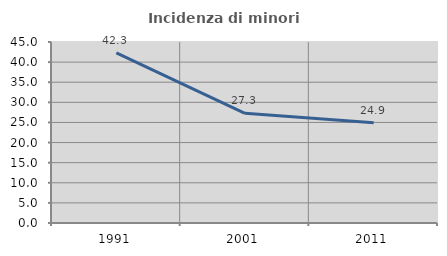
| Category | Incidenza di minori stranieri |
|---|---|
| 1991.0 | 42.308 |
| 2001.0 | 27.273 |
| 2011.0 | 24.928 |